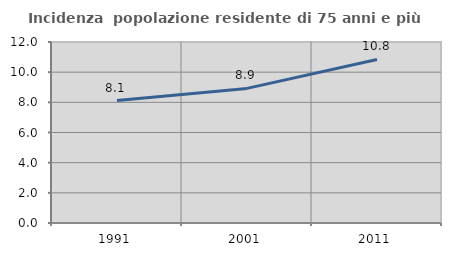
| Category | Incidenza  popolazione residente di 75 anni e più |
|---|---|
| 1991.0 | 8.114 |
| 2001.0 | 8.924 |
| 2011.0 | 10.843 |